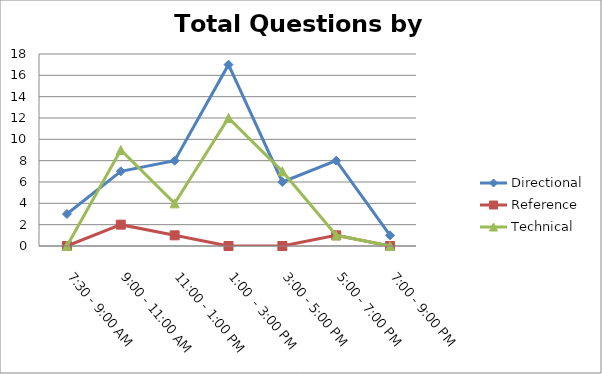
| Category | Directional | Reference | Technical |
|---|---|---|---|
| 7:30 - 9:00 AM | 3 | 0 | 0 |
| 9:00 - 11:00 AM | 7 | 2 | 9 |
| 11:00 - 1:00 PM | 8 | 1 | 4 |
| 1:00  - 3:00 PM | 17 | 0 | 12 |
| 3:00 - 5:00 PM | 6 | 0 | 7 |
| 5:00 - 7:00 PM | 8 | 1 | 1 |
| 7:00 - 9:00 PM | 1 | 0 | 0 |